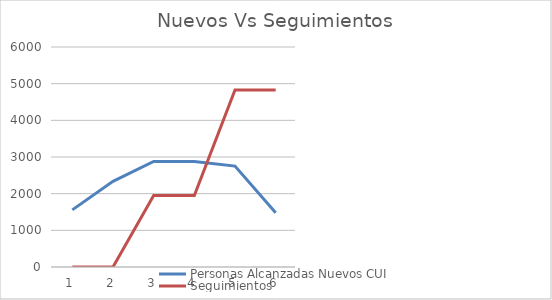
| Category | Personas Alcanzadas Nuevos CUI | Seguimientos |
|---|---|---|
| 0 | 1557.744 | 0 |
| 1 | 2336.616 | 0 |
| 2 | 2878.44 | 1947.18 |
| 3 | 2878.44 | 1947.18 |
| 4 | 2751.45 | 4825.62 |
| 5 | 1481.55 | 4825.62 |